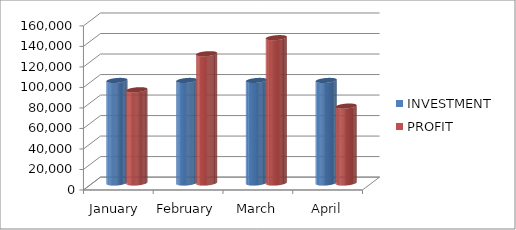
| Category | INVESTMENT  | PROFIT |
|---|---|---|
| January  | 100000 | 90920 |
| February | 100000 | 126050 |
| March | 100000 | 141700 |
| April | 100000 | 75000 |